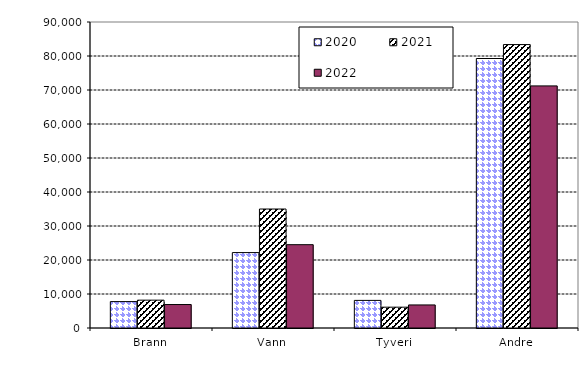
| Category | 2020 | 2021 | 2022 |
|---|---|---|---|
| Brann | 7767.288 | 8185.241 | 6900.047 |
| Vann | 22180.309 | 34994.274 | 24505.067 |
| Tyveri | 8117.27 | 6121.597 | 6778.644 |
| Andre | 79263.819 | 83362.542 | 71207.252 |